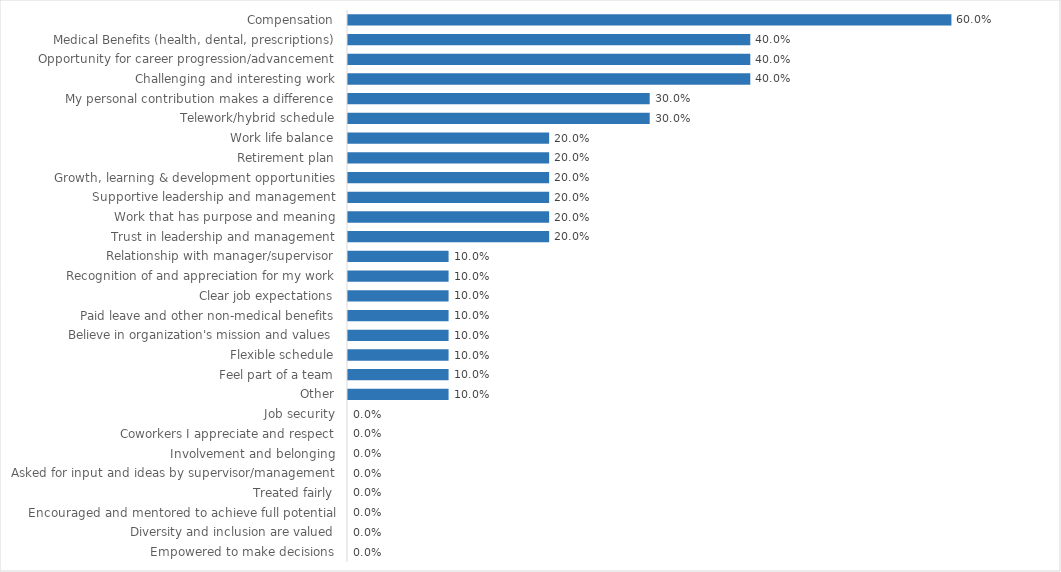
| Category | Auditor of Accounts |
|---|---|
| Compensation | 0.6 |
| Medical Benefits (health, dental, prescriptions) | 0.4 |
| Opportunity for career progression/advancement | 0.4 |
| Challenging and interesting work | 0.4 |
| My personal contribution makes a difference | 0.3 |
| Telework/hybrid schedule | 0.3 |
| Work life balance | 0.2 |
| Retirement plan | 0.2 |
| Growth, learning & development opportunities | 0.2 |
| Supportive leadership and management | 0.2 |
| Work that has purpose and meaning | 0.2 |
| Trust in leadership and management | 0.2 |
| Relationship with manager/supervisor | 0.1 |
| Recognition of and appreciation for my work | 0.1 |
| Clear job expectations | 0.1 |
| Paid leave and other non-medical benefits | 0.1 |
| Believe in organization's mission and values | 0.1 |
| Flexible schedule | 0.1 |
| Feel part of a team | 0.1 |
| Other | 0.1 |
| Job security | 0 |
| Coworkers I appreciate and respect | 0 |
| Involvement and belonging | 0 |
| Asked for input and ideas by supervisor/management | 0 |
| Treated fairly | 0 |
| Encouraged and mentored to achieve full potential | 0 |
| Diversity and inclusion are valued | 0 |
| Empowered to make decisions | 0 |